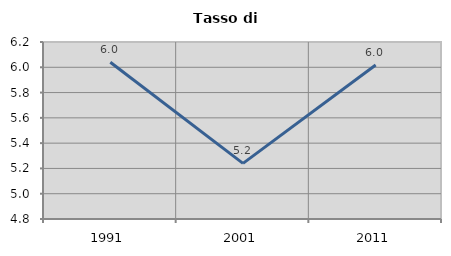
| Category | Tasso di disoccupazione   |
|---|---|
| 1991.0 | 6.039 |
| 2001.0 | 5.24 |
| 2011.0 | 6.018 |